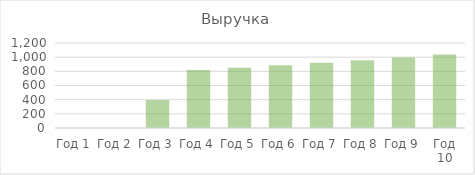
| Category | Выручка |
|---|---|
| Год 1 | 0 |
| Год 2 | 0 |
| Год 3 | 393.702 |
| Год 4 | 818.901 |
| Год 5 | 851.657 |
| Год 6 | 885.723 |
| Год 7 | 921.152 |
| Год 8 | 957.998 |
| Год 9 | 996.318 |
| Год 10 | 1036.171 |